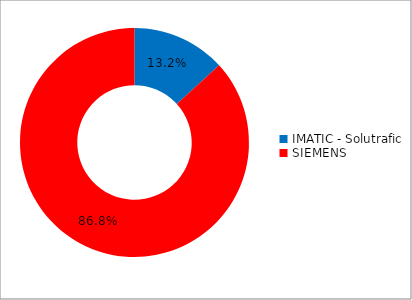
| Category | Series 0 |
|---|---|
| IMATIC - Solutrafic | 0.132 |
| SIEMENS | 0.868 |